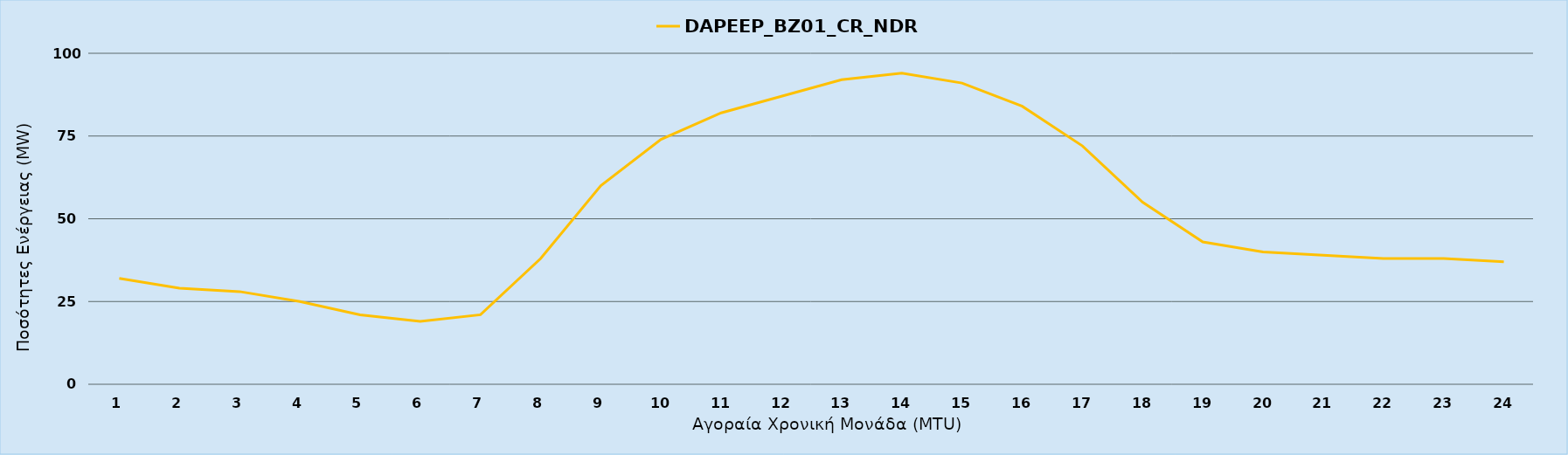
| Category | DAPEEP_BZ01_CR_NDR |
|---|---|
| 0 | 32 |
| 1 | 29 |
| 2 | 28 |
| 3 | 25 |
| 4 | 21 |
| 5 | 19 |
| 6 | 21 |
| 7 | 38 |
| 8 | 60 |
| 9 | 74 |
| 10 | 82 |
| 11 | 87 |
| 12 | 92 |
| 13 | 94 |
| 14 | 91 |
| 15 | 84 |
| 16 | 72 |
| 17 | 55 |
| 18 | 43 |
| 19 | 40 |
| 20 | 39 |
| 21 | 38 |
| 22 | 38 |
| 23 | 37 |